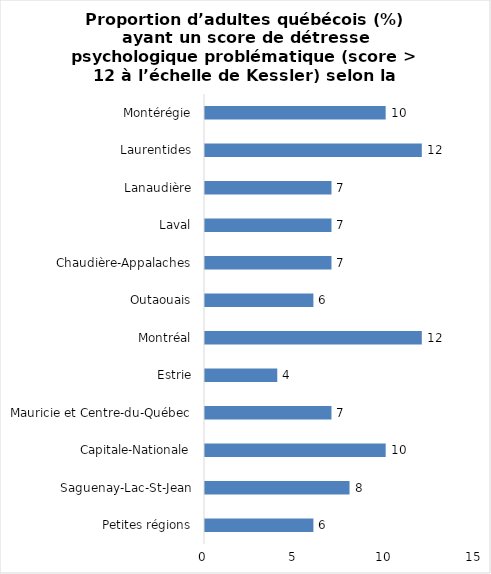
| Category | Series 0 |
|---|---|
| Petites régions | 6 |
| Saguenay-Lac-St-Jean | 8 |
| Capitale-Nationale | 10 |
| Mauricie et Centre-du-Québec | 7 |
| Estrie | 4 |
| Montréal | 12 |
| Outaouais | 6 |
| Chaudière-Appalaches | 7 |
| Laval | 7 |
| Lanaudière | 7 |
| Laurentides | 12 |
| Montérégie | 10 |